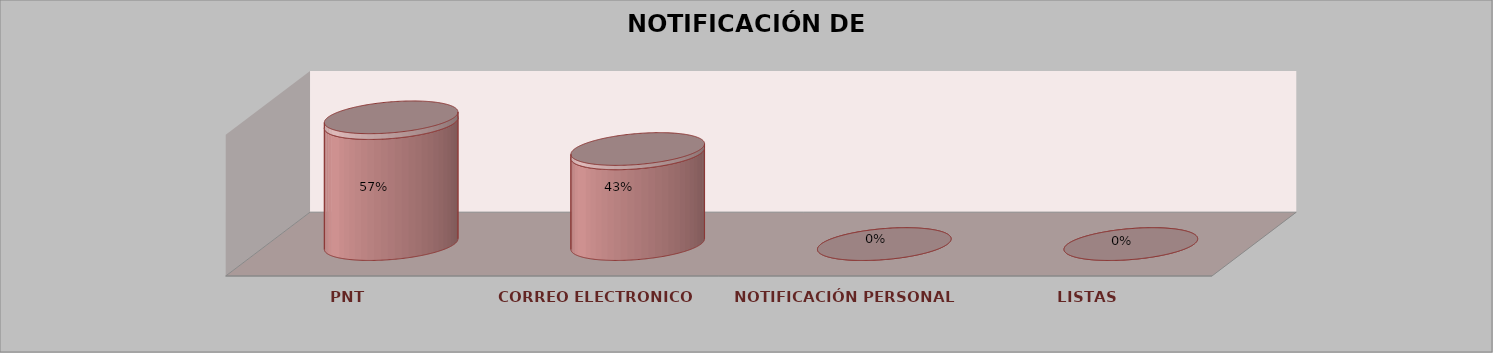
| Category | Series 0 | Series 1 | Series 2 | Series 3 | Series 4 |
|---|---|---|---|---|---|
| PNT |  |  |  | 12 | 0.571 |
| CORREO ELECTRONICO |  |  |  | 9 | 0.429 |
| NOTIFICACIÓN PERSONAL |  |  |  | 0 | 0 |
| LISTAS |  |  |  | 0 | 0 |